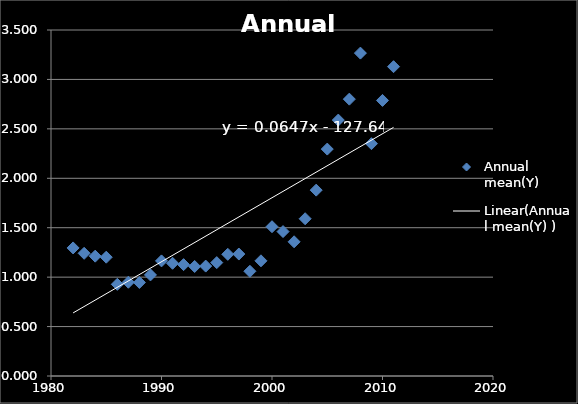
| Category | Annual mean(Y)  |
|---|---|
| 1982.0 | 1.296 |
| 1983.0 | 1.241 |
| 1984.0 | 1.212 |
| 1985.0 | 1.202 |
| 1986.0 | 0.927 |
| 1987.0 | 0.948 |
| 1988.0 | 0.946 |
| 1989.0 | 1.022 |
| 1990.0 | 1.164 |
| 1991.0 | 1.14 |
| 1992.0 | 1.126 |
| 1993.0 | 1.108 |
| 1994.0 | 1.112 |
| 1995.0 | 1.147 |
| 1996.0 | 1.231 |
| 1997.0 | 1.234 |
| 1998.0 | 1.059 |
| 1999.0 | 1.165 |
| 2000.0 | 1.51 |
| 2001.0 | 1.461 |
| 2002.0 | 1.358 |
| 2003.0 | 1.591 |
| 2004.0 | 1.88 |
| 2005.0 | 2.295 |
| 2006.0 | 2.589 |
| 2007.0 | 2.801 |
| 2008.0 | 3.266 |
| 2009.0 | 2.35 |
| 2010.0 | 2.788 |
| 2011.0 | 3.129 |